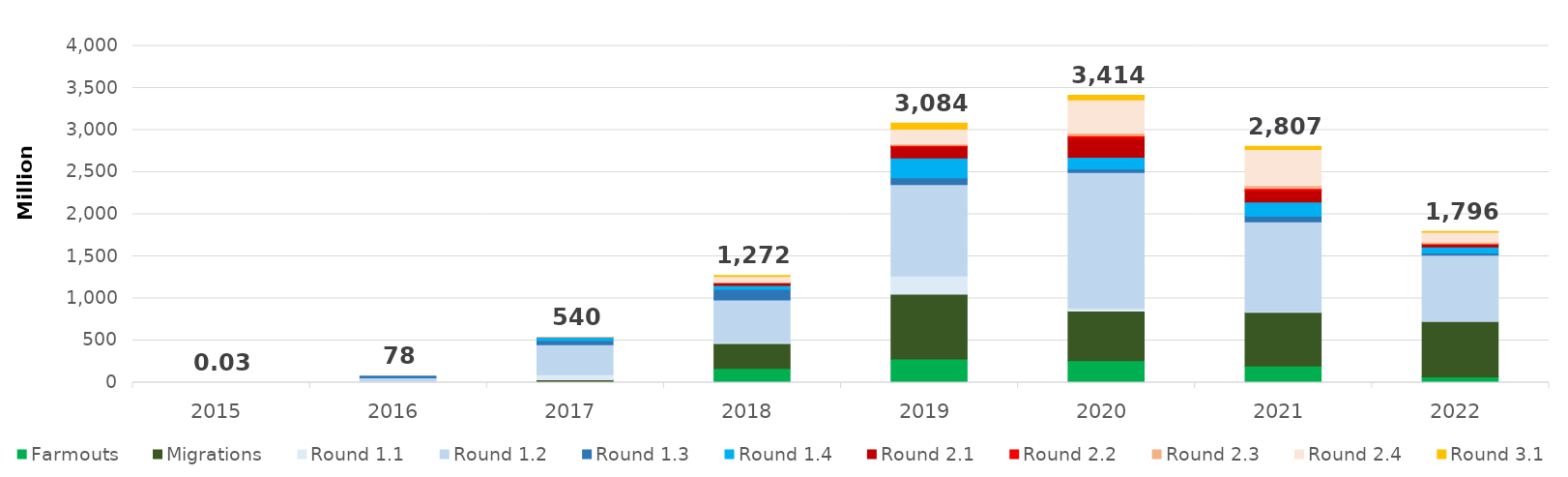
| Category | Farmouts | Migrations | Round 1.1 | Round 1.2 | Round 1.3 | Round 1.4 | Round 2.1 | Round 2.2 | Round 2.3 | Round 2.4 | Round 3.1 |
|---|---|---|---|---|---|---|---|---|---|---|---|
| 2015.0 | 0 | 0 | 0.023 | 0.003 | 0 | 0 | 0 | 0 | 0 | 0 | 0 |
| 2016.0 | 0 | 0 | 7.936 | 50.902 | 19.085 | 0 | 0 | 0 | 0 | 0 | 0 |
| 2017.0 | 1.551 | 32.93 | 60.276 | 356.292 | 49.062 | 38.707 | 0.93 | 0 | 0.096 | 0 | 0 |
| 2018.0 | 168.66 | 295.724 | 16.154 | 501.142 | 126.254 | 47.616 | 27.488 | 2.558 | 10.38 | 66.299 | 10.15 |
| 2019.0 | 280.617 | 772.208 | 213.486 | 1086.442 | 82.07 | 235.595 | 134.934 | 12.535 | 18.891 | 175.703 | 71.663 |
| 2020.0 | 260.987 | 590.016 | 33.998 | 1610.735 | 43.009 | 140.295 | 223.002 | 33.095 | 30.995 | 391.695 | 56.039 |
| 2021.0 | 198.847 | 638.47 | 8.662 | 1065.356 | 66.065 | 167.952 | 137.48 | 25.23 | 32.508 | 430.798 | 36.109 |
| 2022.0 | 68.331 | 662.712 | 0.096 | 783.942 | 24.29 | 73.812 | 34.669 | 0.942 | 20.55 | 117.938 | 8.481 |